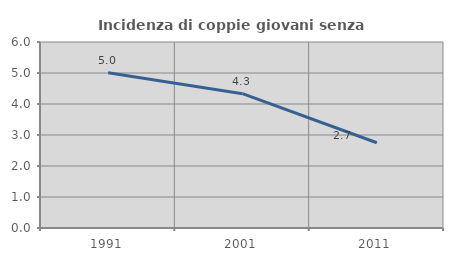
| Category | Incidenza di coppie giovani senza figli |
|---|---|
| 1991.0 | 5.005 |
| 2001.0 | 4.333 |
| 2011.0 | 2.749 |